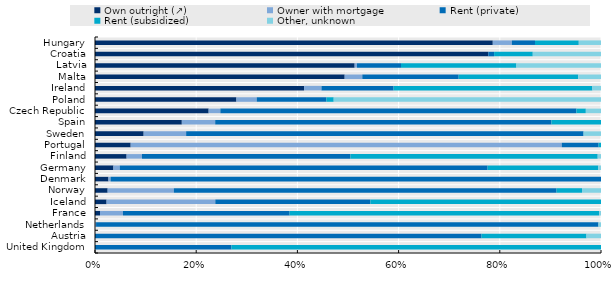
| Category | Own outright (↗) | Owner with mortgage | Rent (private) | Rent (subsidized) | Other, unknown |
|---|---|---|---|---|---|
| United Kingdom | 0 | 0 | 0.27 | 0.73 | 0 |
| Austria | 0 | 0 | 0.764 | 0.207 | 0.029 |
| Netherlands | 0 | 0.002 | 0.993 | 0 | 0.005 |
| France | 0.01 | 0.045 | 0.329 | 0.612 | 0.004 |
| Iceland | 0.023 | 0.215 | 0.306 | 0.456 | 0 |
| Norway | 0.025 | 0.131 | 0.756 | 0.05 | 0.037 |
| Denmark | 0.027 | 0.004 | 0.969 | 0 | 0 |
| Germany | 0.036 | 0.012 | 0.727 | 0.219 | 0.005 |
| Finland | 0.062 | 0.03 | 0.412 | 0.489 | 0.007 |
| Portugal | 0.071 | 0.852 | 0.073 | 0.005 | 0 |
| Sweden | 0.096 | 0.084 | 0.785 | 0 | 0.034 |
| Spain | 0.172 | 0.066 | 0.665 | 0.098 | 0 |
| Czech Republic | 0.225 | 0.023 | 0.704 | 0.019 | 0.03 |
| Poland | 0.28 | 0.04 | 0.138 | 0.014 | 0.528 |
| Ireland | 0.413 | 0.034 | 0.143 | 0.393 | 0.017 |
| Malta | 0.493 | 0.035 | 0.19 | 0.236 | 0.045 |
| Latvia | 0.513 | 0.005 | 0.087 | 0.228 | 0.167 |
| Croatia | 0.777 | 0 | 0.011 | 0.076 | 0.135 |
| Hungary | 0.786 | 0.038 | 0.046 | 0.087 | 0.044 |